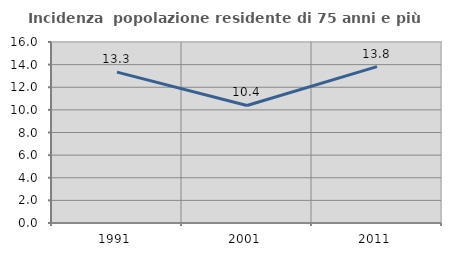
| Category | Incidenza  popolazione residente di 75 anni e più |
|---|---|
| 1991.0 | 13.333 |
| 2001.0 | 10.39 |
| 2011.0 | 13.821 |